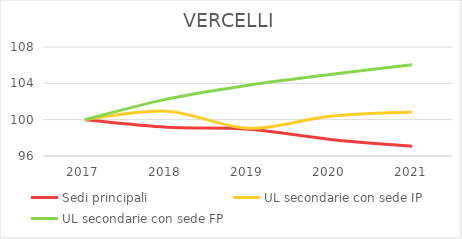
| Category | Sedi principali | UL secondarie con sede IP | UL secondarie con sede FP |
|---|---|---|---|
| 2017.0 | 100 | 100 | 100 |
| 2018.0 | 99.169 | 100.94 | 102.263 |
| 2019.0 | 98.949 | 99.06 | 103.796 |
| 2020.0 | 97.825 | 100.376 | 104.964 |
| 2021.0 | 97.079 | 100.846 | 106.058 |